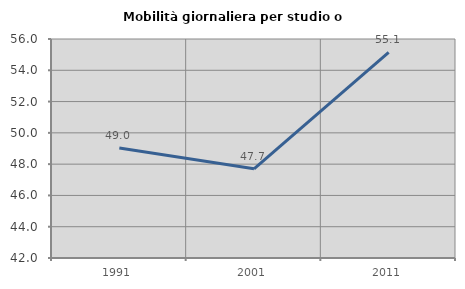
| Category | Mobilità giornaliera per studio o lavoro |
|---|---|
| 1991.0 | 49.031 |
| 2001.0 | 47.703 |
| 2011.0 | 55.141 |